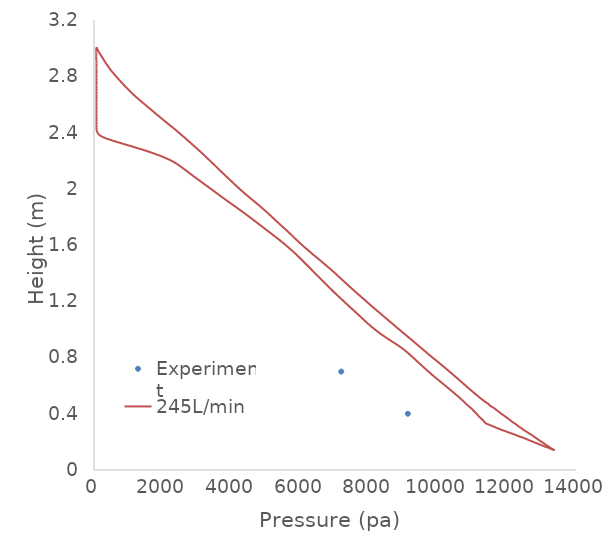
| Category | Experiment |
|---|---|
| 9116.0 | 0.4 |
| 7181.0 | 0.7 |